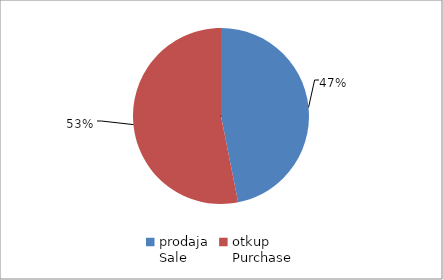
| Category | Series 0 |
|---|---|
| prodaja
Sale | 114710443.05 |
| otkup
Purchase | 129973649.14 |